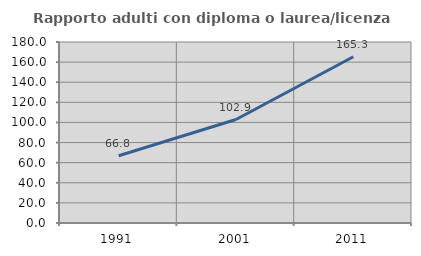
| Category | Rapporto adulti con diploma o laurea/licenza media  |
|---|---|
| 1991.0 | 66.834 |
| 2001.0 | 102.905 |
| 2011.0 | 165.333 |